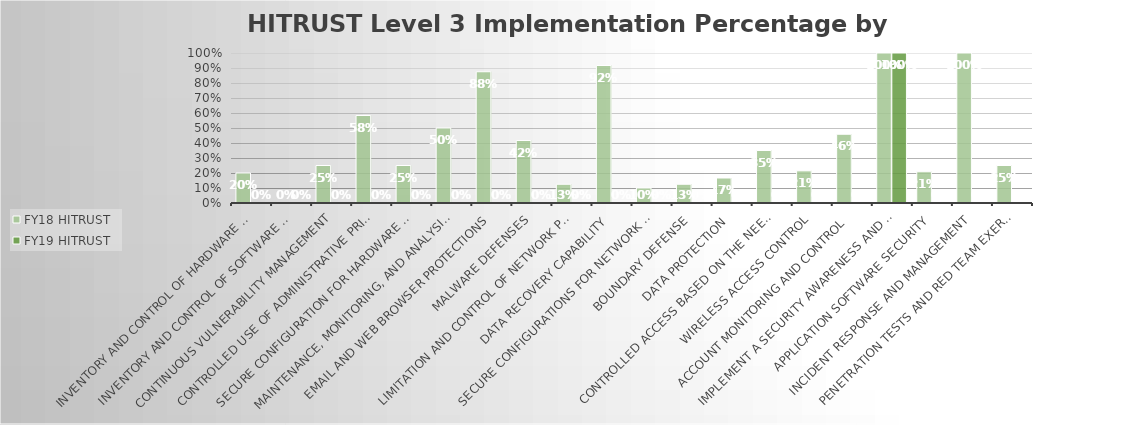
| Category | FY18 HITRUST | FY19 HITRUST  |
|---|---|---|
| Inventory and Control of Hardware Assets | 0.2 | 0 |
| Inventory and Control of Software Assets | 0 | 0 |
| Continuous Vulnerability Management | 0.25 | 0 |
| Controlled Use of Administrative Privileges | 0.583 | 0 |
| Secure Configuration for Hardware and Software | 0.25 | 0 |
| Maintenance, Monitoring, and Analysis of Audit Logs | 0.5 | 0 |
| Email and Web Browser Protections | 0.875 | 0 |
| Malware Defenses | 0.417 | 0 |
| Limitation and Control of Network Ports | 0.125 | 0 |
| Data Recovery Capability | 0.917 | 0 |
| Secure Configurations for Network Devices | 0.1 | 0 |
| Boundary Defense | 0.125 | 0 |
| Data Protection | 0.167 | 0 |
| Controlled Access Based on the Need to Know | 0.35 | 0 |
| Wireless Access Control | 0.214 | 0 |
| Account Monitoring and Control | 0.458 | 0 |
| Implement a Security Awareness and Training Program | 1 | 1 |
| Application Software Security | 0.208 | 0 |
| Incident Response and Management | 1 | 0 |
| Penetration Tests and Red Team Exercises | 0.25 | 0 |